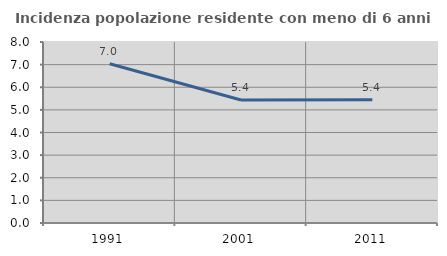
| Category | Incidenza popolazione residente con meno di 6 anni |
|---|---|
| 1991.0 | 7.041 |
| 2001.0 | 5.438 |
| 2011.0 | 5.446 |